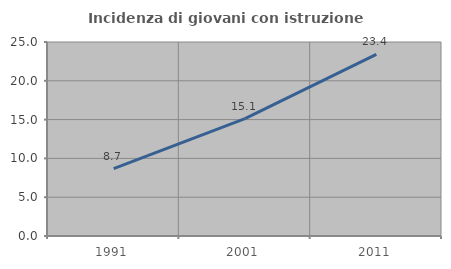
| Category | Incidenza di giovani con istruzione universitaria |
|---|---|
| 1991.0 | 8.686 |
| 2001.0 | 15.137 |
| 2011.0 | 23.404 |